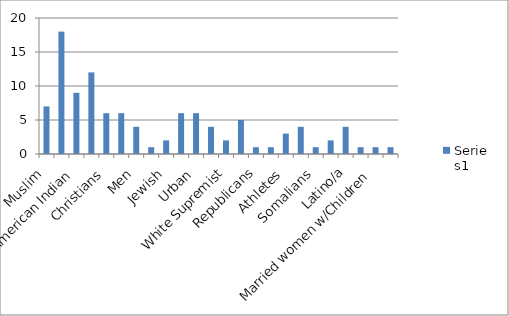
| Category | Series 0 |
|---|---|
| Muslim | 7 |
| African American | 18 |
| American Indian | 9 |
| Hmong | 12 |
| Christians | 6 |
| Homsexual | 6 |
| Men | 4 |
| Religion | 1 |
| Jewish | 2 |
| No education | 6 |
| Urban | 6 |
| Rural | 4 |
| White Supremist | 2 |
| Rich/Privileged | 5 |
| Republicans | 1 |
| Welfare  | 1 |
| Athletes | 3 |
| Obese | 4 |
| Somalians | 1 |
| French Canadians | 2 |
| Latino/a | 4 |
| Athiest | 1 |
| Married women w/Children | 1 |
| Yankee | 1 |